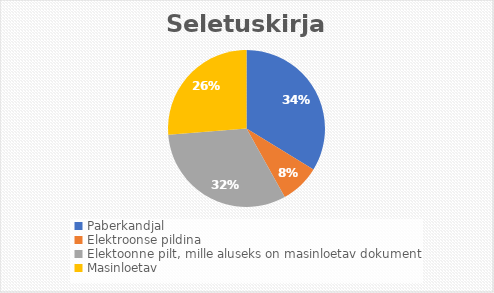
| Category | Series 0 |
|---|---|
| Paberkandjal | 34.08 |
| Elektroonse pildina | 8.246 |
| Elektoonne pilt, mille aluseks on masinloetav dokument | 32.14 |
| Masinloetav | 26.545 |